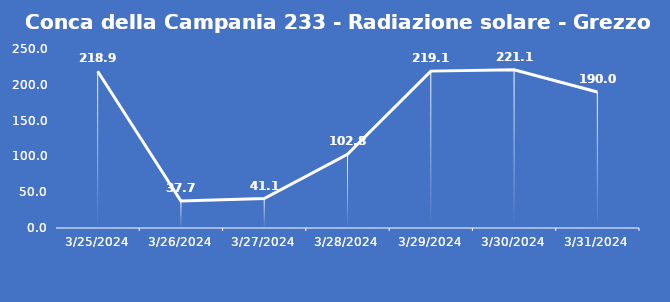
| Category | Conca della Campania 233 - Radiazione solare - Grezzo (W/m2) |
|---|---|
| 3/25/24 | 218.9 |
| 3/26/24 | 37.7 |
| 3/27/24 | 41.1 |
| 3/28/24 | 102.8 |
| 3/29/24 | 219.1 |
| 3/30/24 | 221.1 |
| 3/31/24 | 190 |